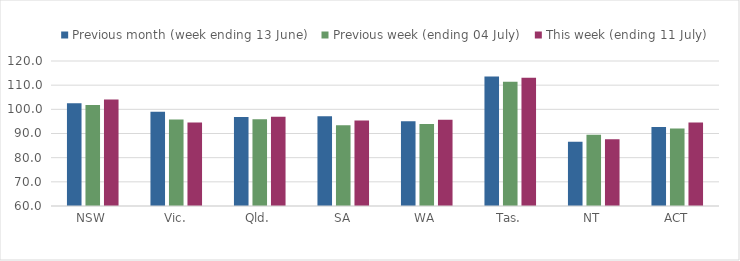
| Category | Previous month (week ending 13 June) | Previous week (ending 04 July) | This week (ending 11 July) |
|---|---|---|---|
| NSW | 102.526 | 101.807 | 104.032 |
| Vic. | 99.015 | 95.752 | 94.598 |
| Qld. | 96.872 | 95.856 | 96.897 |
| SA | 97.103 | 93.45 | 95.331 |
| WA | 95.063 | 93.934 | 95.714 |
| Tas. | 113.549 | 111.392 | 113.046 |
| NT | 86.611 | 89.446 | 87.587 |
| ACT | 92.715 | 92.053 | 94.57 |